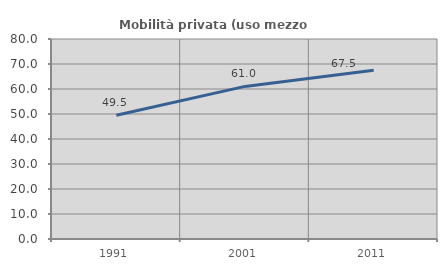
| Category | Mobilità privata (uso mezzo privato) |
|---|---|
| 1991.0 | 49.498 |
| 2001.0 | 61.036 |
| 2011.0 | 67.461 |